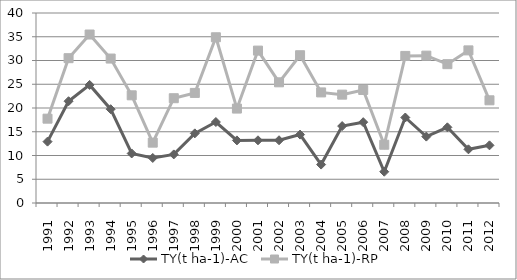
| Category | TY(t ha-1)-AC | TY(t ha-1)-RP |
|---|---|---|
| 1991.0 | 12.92 | 17.755 |
| 1992.0 | 21.43 | 30.49 |
| 1993.0 | 24.86 | 35.47 |
| 1994.0 | 19.75 | 30.41 |
| 1995.0 | 10.43 | 22.67 |
| 1996.0 | 9.48 | 12.705 |
| 1997.0 | 10.23 | 22.061 |
| 1998.0 | 14.661 | 23.175 |
| 1999.0 | 17.05 | 34.89 |
| 2000.0 | 13.18 | 19.88 |
| 2001.0 | 13.2 | 32.084 |
| 2002.0 | 13.21 | 25.408 |
| 2003.0 | 14.403 | 31.11 |
| 2004.0 | 8.09 | 23.28 |
| 2005.0 | 16.193 | 22.81 |
| 2006.0 | 17.015 | 23.795 |
| 2007.0 | 6.583 | 12.264 |
| 2008.0 | 17.999 | 30.965 |
| 2009.0 | 13.98 | 31.02 |
| 2010.0 | 15.93 | 29.23 |
| 2011.0 | 11.3 | 32.13 |
| 2012.0 | 12.14 | 21.62 |